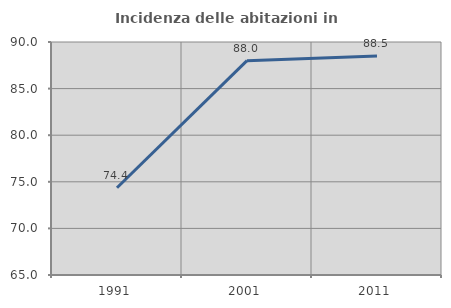
| Category | Incidenza delle abitazioni in proprietà  |
|---|---|
| 1991.0 | 74.359 |
| 2001.0 | 88 |
| 2011.0 | 88.506 |